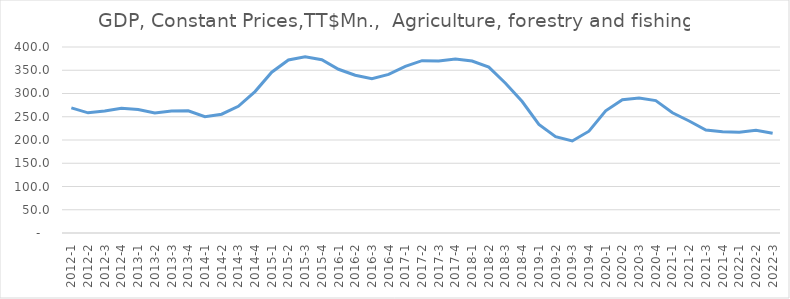
| Category | Series 0 |
|---|---|
| 2012-1 | 269.04 |
| 2012-2 | 258.44 |
| 2012-3 | 262.496 |
| 2012-4 | 268.481 |
| 2013-1 | 265.646 |
| 2013-2 | 258.321 |
| 2013-3 | 262.19 |
| 2013-4 | 262.903 |
| 2014-1 | 249.977 |
| 2014-2 | 255.507 |
| 2014-3 | 272.569 |
| 2014-4 | 304.109 |
| 2015-1 | 345.753 |
| 2015-2 | 372.082 |
| 2015-3 | 378.789 |
| 2015-4 | 372.464 |
| 2016-1 | 352.103 |
| 2016-2 | 339.191 |
| 2016-3 | 331.792 |
| 2016-4 | 341.202 |
| 2017-1 | 358.496 |
| 2017-2 | 370.633 |
| 2017-3 | 369.737 |
| 2017-4 | 374.274 |
| 2018-1 | 369.83 |
| 2018-2 | 356.725 |
| 2018-3 | 321.985 |
| 2018-4 | 282.638 |
| 2019-1 | 233.399 |
| 2019-2 | 207.232 |
| 2019-3 | 197.917 |
| 2019-4 | 218.911 |
| 2020-1 | 262.731 |
| 2020-2 | 286.785 |
| 2020-3 | 290.229 |
| 2020-4 | 284.756 |
| 2021-1 | 258.519 |
| 2021-2 | 240.913 |
| 2021-3 | 221.299 |
| 2021-4 | 217.667 |
| 2022-1 | 216.654 |
| 2022-2 | 220.963 |
| 2022-3 | 214.375 |